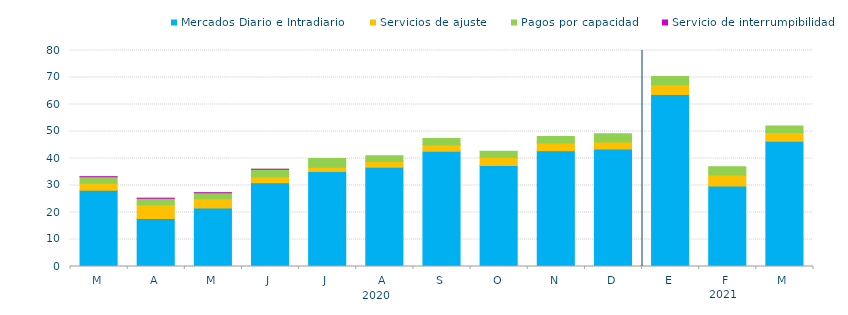
| Category | Mercados Diario e Intradiario  | Servicios de ajuste | Pagos por capacidad | Servicio de interrumpibilidad |
|---|---|---|---|---|
| M | 28.27 | 2.55 | 2.39 | 0.03 |
| A | 17.79 | 5.05 | 2.42 | 0.04 |
| M | 21.69 | 3.36 | 2.25 | 0.04 |
| J | 30.98 | 2.24 | 2.76 | 0.04 |
| J | 35.19 | 1.6 | 3.23 | 0 |
| A | 36.74 | 2.18 | 2.12 | 0 |
| S | 42.72 | 2.36 | 2.37 | 0 |
| O | 37.45 | 2.95 | 2.27 | 0 |
| N | 42.88 | 2.88 | 2.37 | 0 |
| D | 43.5 | 2.6 | 3.1 | 0 |
| E | 63.67 | 3.65 | 3.08 | 0 |
| F | 29.84 | 4.04 | 3.05 | 0 |
| M | 46.37 | 3.26 | 2.42 | 0 |